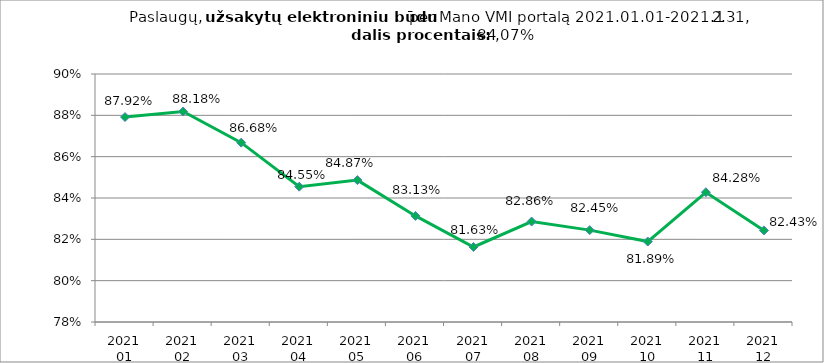
| Category | Elektroniniu būdu užsakytų paslaugų dalis procentais (lyginant su visomis  užsakytomis paslaugomis) |
|---|---|
| 2021 01 mėn. | 0.879 |
| 2021 02 mėn. | 0.882 |
| 2021 03 mėn. | 0.867 |
| 2021 04 mėn. | 0.845 |
| 2021 05 mėn. | 0.849 |
| 2021 06 mėn. | 0.831 |
| 2021 07 mėn. | 0.816 |
| 2021 08 mėn. | 0.829 |
| 2021 09 mėn. | 0.824 |
| 2021 10 mėn. | 0.819 |
| 2021 11 mėn. | 0.843 |
| 2021 12 mėn. | 0.824 |